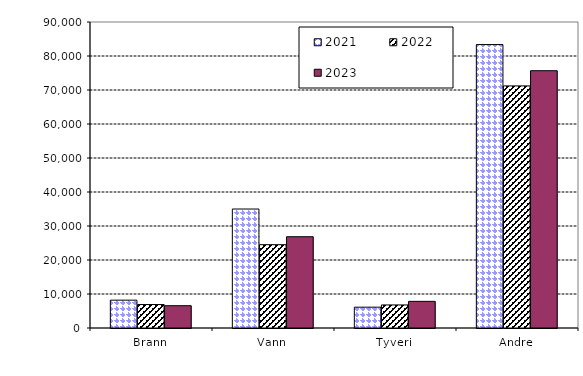
| Category | 2021 | 2022 | 2023 |
|---|---|---|---|
| Brann | 8185.241 | 6900.047 | 6557.236 |
| Vann | 34994.274 | 24505.067 | 26844.315 |
| Tyveri | 6121.597 | 6778.644 | 7838.541 |
| Andre | 83362.542 | 71207.252 | 75674.262 |